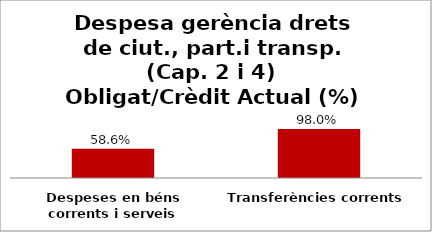
| Category | Series 0 |
|---|---|
| Despeses en béns corrents i serveis | 0.586 |
| Transferències corrents | 0.98 |